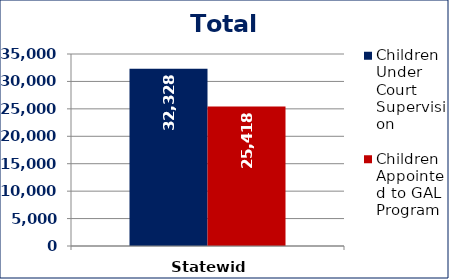
| Category | Children Under Court Supervision  | Children Appointed to GAL Program  |
|---|---|---|
| Statewide | 32328 | 25418 |